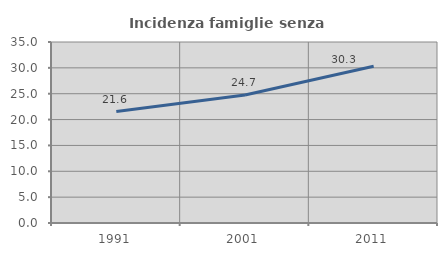
| Category | Incidenza famiglie senza nuclei |
|---|---|
| 1991.0 | 21.553 |
| 2001.0 | 24.747 |
| 2011.0 | 30.324 |